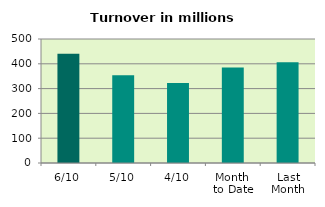
| Category | Series 0 |
|---|---|
| 6/10 | 440.455 |
| 5/10 | 354.227 |
| 4/10 | 322.861 |
| Month 
to Date | 385.125 |
| Last
Month | 405.806 |